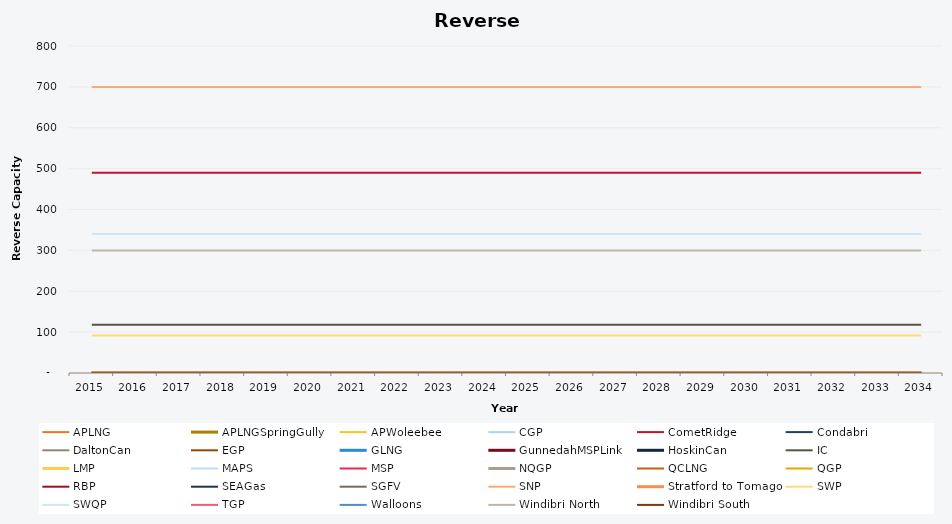
| Category | APLNG | APLNGSpringGully | APWoleebee | CGP | CometRidge | Condabri | DaltonCan | EGP | GLNG | GunnedahMSPLink | HoskinCan | IC | LMP | MAPS | MSP | NQGP | QCLNG | QGP | RBP | SEAGas | SGFV | SNP | Stratford to Tomago | SWP | SWQP | TGP | Walloons | Windibri North | Windibri South |
|---|---|---|---|---|---|---|---|---|---|---|---|---|---|---|---|---|---|---|---|---|---|---|---|---|---|---|---|---|---|
| 2015.0 | 0 | 0 | 0 | 0 | 490 | 0 | 0 | 0 | 0 | 0 | 0 | 118 | 0 | 0 | 0 | 0 | 0 | 0 | 0 | 0 | 0 | 700 | 0 | 92 | 340 | 0 | 0 | 300 | 0 |
| 2016.0 | 0 | 0 | 0 | 0 | 490 | 0 | 0 | 0 | 0 | 0 | 0 | 118 | 0 | 0 | 0 | 0 | 0 | 0 | 0 | 0 | 0 | 700 | 0 | 92 | 340 | 0 | 0 | 300 | 0 |
| 2017.0 | 0 | 0 | 0 | 0 | 490 | 0 | 0 | 0 | 0 | 0 | 0 | 118 | 0 | 0 | 0 | 0 | 0 | 0 | 0 | 0 | 0 | 700 | 0 | 92 | 340 | 0 | 0 | 300 | 0 |
| 2018.0 | 0 | 0 | 0 | 0 | 490 | 0 | 0 | 0 | 0 | 0 | 0 | 118 | 0 | 0 | 0 | 0 | 0 | 0 | 0 | 0 | 0 | 700 | 0 | 92 | 340 | 0 | 0 | 300 | 0 |
| 2019.0 | 0 | 0 | 0 | 0 | 490 | 0 | 0 | 0 | 0 | 0 | 0 | 118 | 0 | 0 | 0 | 0 | 0 | 0 | 0 | 0 | 0 | 700 | 0 | 92 | 340 | 0 | 0 | 300 | 0 |
| 2020.0 | 0 | 0 | 0 | 0 | 490 | 0 | 0 | 0 | 0 | 0 | 0 | 118 | 0 | 0 | 0 | 0 | 0 | 0 | 0 | 0 | 0 | 700 | 0 | 92 | 340 | 0 | 0 | 300 | 0 |
| 2021.0 | 0 | 0 | 0 | 0 | 490 | 0 | 0 | 0 | 0 | 0 | 0 | 118 | 0 | 0 | 0 | 0 | 0 | 0 | 0 | 0 | 0 | 700 | 0 | 92 | 340 | 0 | 0 | 300 | 0 |
| 2022.0 | 0 | 0 | 0 | 0 | 490 | 0 | 0 | 0 | 0 | 0 | 0 | 118 | 0 | 0 | 0 | 0 | 0 | 0 | 0 | 0 | 0 | 700 | 0 | 92 | 340 | 0 | 0 | 300 | 0 |
| 2023.0 | 0 | 0 | 0 | 0 | 490 | 0 | 0 | 0 | 0 | 0 | 0 | 118 | 0 | 0 | 0 | 0 | 0 | 0 | 0 | 0 | 0 | 700 | 0 | 92 | 340 | 0 | 0 | 300 | 0 |
| 2024.0 | 0 | 0 | 0 | 0 | 490 | 0 | 0 | 0 | 0 | 0 | 0 | 118 | 0 | 0 | 0 | 0 | 0 | 0 | 0 | 0 | 0 | 700 | 0 | 92 | 340 | 0 | 0 | 300 | 0 |
| 2025.0 | 0 | 0 | 0 | 0 | 490 | 0 | 0 | 0 | 0 | 0 | 0 | 118 | 0 | 0 | 0 | 0 | 0 | 0 | 0 | 0 | 0 | 700 | 0 | 92 | 340 | 0 | 0 | 300 | 0 |
| 2026.0 | 0 | 0 | 0 | 0 | 490 | 0 | 0 | 0 | 0 | 0 | 0 | 118 | 0 | 0 | 0 | 0 | 0 | 0 | 0 | 0 | 0 | 700 | 0 | 92 | 340 | 0 | 0 | 300 | 0 |
| 2027.0 | 0 | 0 | 0 | 0 | 490 | 0 | 0 | 0 | 0 | 0 | 0 | 118 | 0 | 0 | 0 | 0 | 0 | 0 | 0 | 0 | 0 | 700 | 0 | 92 | 340 | 0 | 0 | 300 | 0 |
| 2028.0 | 0 | 0 | 0 | 0 | 490 | 0 | 0 | 0 | 0 | 0 | 0 | 118 | 0 | 0 | 0 | 0 | 0 | 0 | 0 | 0 | 0 | 700 | 0 | 92 | 340 | 0 | 0 | 300 | 0 |
| 2029.0 | 0 | 0 | 0 | 0 | 490 | 0 | 0 | 0 | 0 | 0 | 0 | 118 | 0 | 0 | 0 | 0 | 0 | 0 | 0 | 0 | 0 | 700 | 0 | 92 | 340 | 0 | 0 | 300 | 0 |
| 2030.0 | 0 | 0 | 0 | 0 | 490 | 0 | 0 | 0 | 0 | 0 | 0 | 118 | 0 | 0 | 0 | 0 | 0 | 0 | 0 | 0 | 0 | 700 | 0 | 92 | 340 | 0 | 0 | 300 | 0 |
| 2031.0 | 0 | 0 | 0 | 0 | 490 | 0 | 0 | 0 | 0 | 0 | 0 | 118 | 0 | 0 | 0 | 0 | 0 | 0 | 0 | 0 | 0 | 700 | 0 | 92 | 340 | 0 | 0 | 300 | 0 |
| 2032.0 | 0 | 0 | 0 | 0 | 490 | 0 | 0 | 0 | 0 | 0 | 0 | 118 | 0 | 0 | 0 | 0 | 0 | 0 | 0 | 0 | 0 | 700 | 0 | 92 | 340 | 0 | 0 | 300 | 0 |
| 2033.0 | 0 | 0 | 0 | 0 | 490 | 0 | 0 | 0 | 0 | 0 | 0 | 118 | 0 | 0 | 0 | 0 | 0 | 0 | 0 | 0 | 0 | 700 | 0 | 92 | 340 | 0 | 0 | 300 | 0 |
| 2034.0 | 0 | 0 | 0 | 0 | 490 | 0 | 0 | 0 | 0 | 0 | 0 | 118 | 0 | 0 | 0 | 0 | 0 | 0 | 0 | 0 | 0 | 700 | 0 | 92 | 340 | 0 | 0 | 300 | 0 |